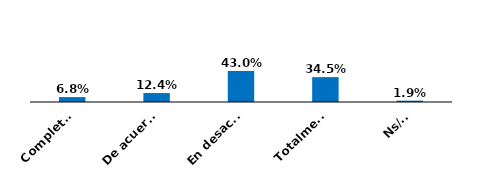
| Category | Series 0 |
|---|---|
| Completamente de acuerdo | 0.068 |
| De acuerdo | 0.124 |
| En desacuerdo | 0.43 |
| Totalmente en desacuerdo | 0.345 |
| Ns/Nr | 0.019 |